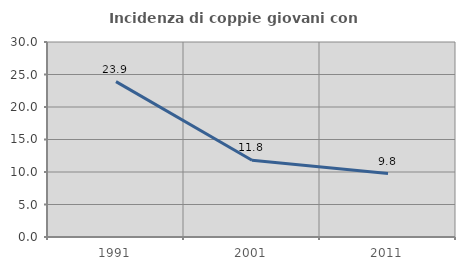
| Category | Incidenza di coppie giovani con figli |
|---|---|
| 1991.0 | 23.899 |
| 2001.0 | 11.803 |
| 2011.0 | 9.764 |